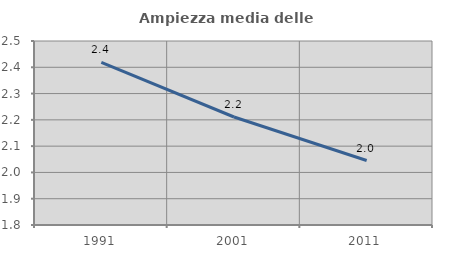
| Category | Ampiezza media delle famiglie |
|---|---|
| 1991.0 | 2.418 |
| 2001.0 | 2.211 |
| 2011.0 | 2.045 |